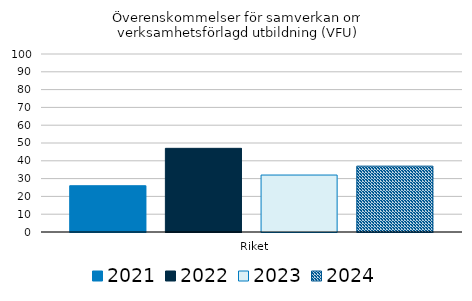
| Category | 2021 | 2022 | 2023 | 2024 |
|---|---|---|---|---|
|   Riket | 26 | 47 | 32 | 37 |